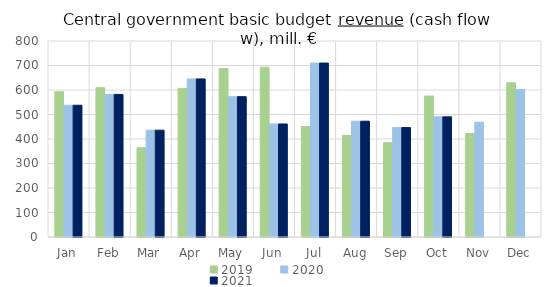
| Category | 2019 | 2020 | 2021 |
|---|---|---|---|
| Jan | 592846.619 | 537722.948 | 537722.948 |
| Feb | 609456.426 | 582097.989 | 582097.989 |
| Mar | 364332.636 | 436083.224 | 436083.224 |
| Apr | 606454.195 | 645256.276 | 645256.276 |
| May | 687359.339 | 572854.69 | 572854.69 |
| Jun | 693121.785 | 461405.873 | 461405.873 |
| Jul | 450770.716 | 709928.085 | 709928.085 |
| Aug | 414515.425 | 472605.695 | 472605.695 |
| Sep | 385164.824 | 446749.915 | 446749.915 |
| Oct | 575424.59 | 490335.515 | 490335.515 |
| Nov | 422027.285 | 468560.222 | 0 |
| Dec | 629644.768 | 601482.069 | 0 |